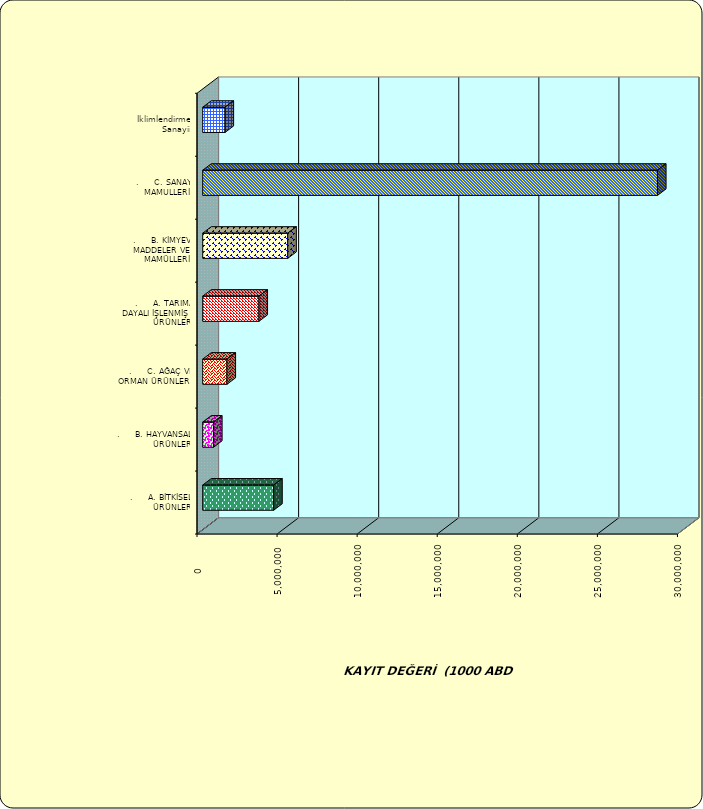
| Category | Series 0 |
|---|---|
| .     A. BİTKİSEL ÜRÜNLER | 4430969.349 |
| .     B. HAYVANSAL ÜRÜNLER | 674161.917 |
| .     C. AĞAÇ VE ORMAN ÜRÜNLERİ | 1515952.377 |
| .     A. TARIMA DAYALI İŞLENMİŞ ÜRÜNLER | 3511998.674 |
| .     B. KİMYEVİ MADDELER VE MAMÜLLERİ | 5310577.846 |
| .     C. SANAYİ MAMULLERİ | 28395578.479 |
|  İklimlendirme Sanayii | 1393256.457 |